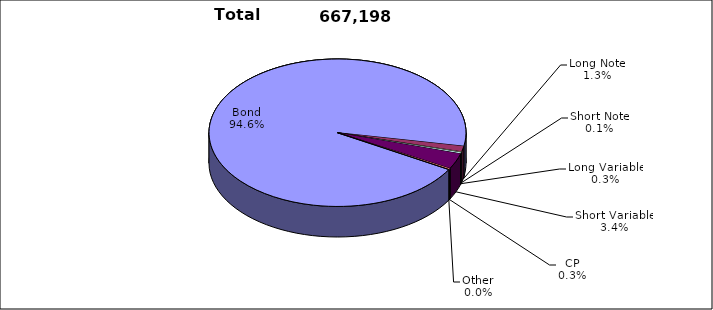
| Category | Trades |
|---|---|
| Bond | 631097 |
| Long Note | 8355 |
| Short Note | 899 |
| Long Variable | 2058 |
| Short Variable | 22848 |
| CP | 1770 |
| Other | 171 |